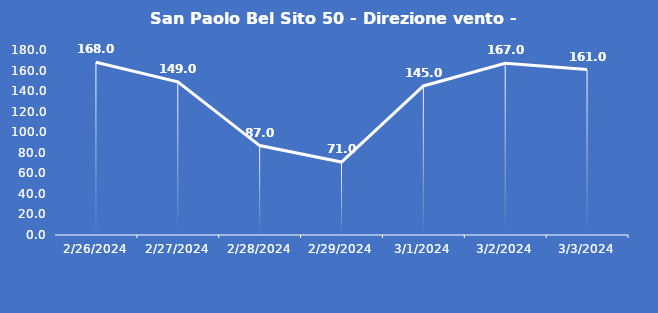
| Category | San Paolo Bel Sito 50 - Direzione vento - Grezzo (°N) |
|---|---|
| 2/26/24 | 168 |
| 2/27/24 | 149 |
| 2/28/24 | 87 |
| 2/29/24 | 71 |
| 3/1/24 | 145 |
| 3/2/24 | 167 |
| 3/3/24 | 161 |